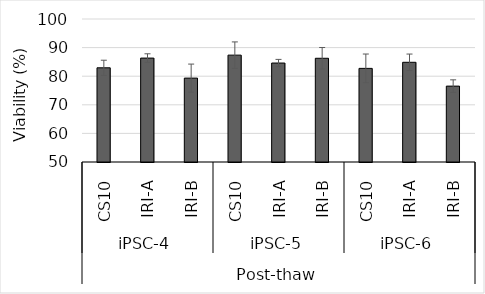
| Category | Series 0 |
|---|---|
| 0 | 82.933 |
| 1 | 86.333 |
| 2 | 79.333 |
| 3 | 87.367 |
| 4 | 84.6 |
| 5 | 86.267 |
| 6 | 82.733 |
| 7 | 84.867 |
| 8 | 76.533 |